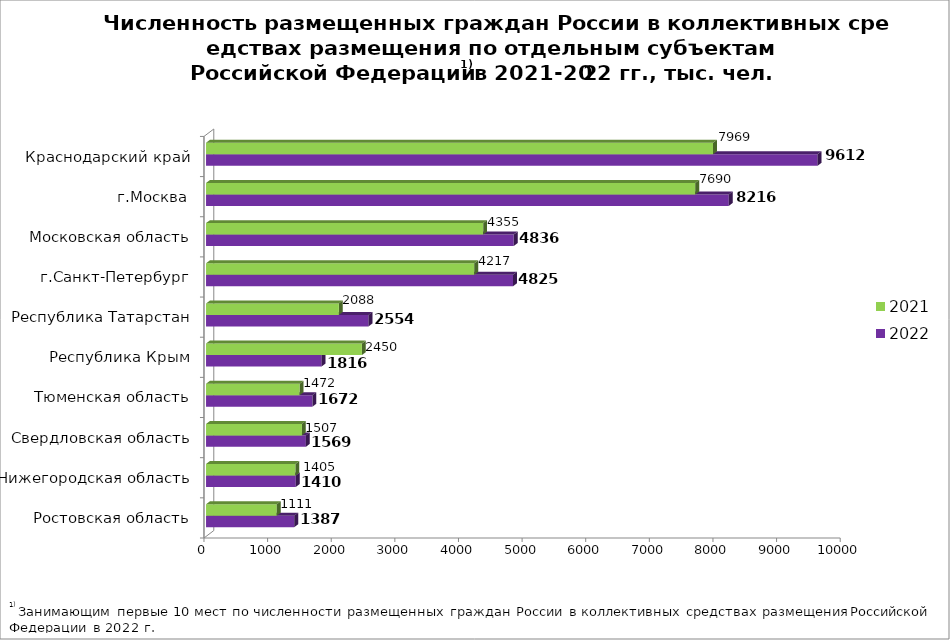
| Category | 2022 | 2021 |
|---|---|---|
| Ростовская область | 1386.968 | 1111.29 |
| Нижегородская область | 1410.237 | 1405.271 |
| Свердловская область | 1568.657 | 1507.462 |
| Тюменская область | 1672.216 | 1471.809 |
| Республика Крым | 1815.792 | 2449.965 |
| Республика Татарстан | 2554.446 | 2088.024 |
| г.Санкт-Петербург | 4825.19 | 4216.895 |
| Московская область | 4835.768 | 4355.236 |
| г.Москва | 8216.004 | 7690.263 |
| Краснодарский край | 9611.921 | 7969.424 |